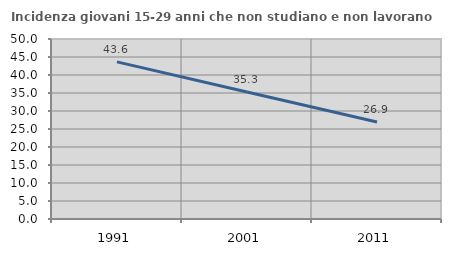
| Category | Incidenza giovani 15-29 anni che non studiano e non lavorano  |
|---|---|
| 1991.0 | 43.636 |
| 2001.0 | 35.284 |
| 2011.0 | 26.928 |